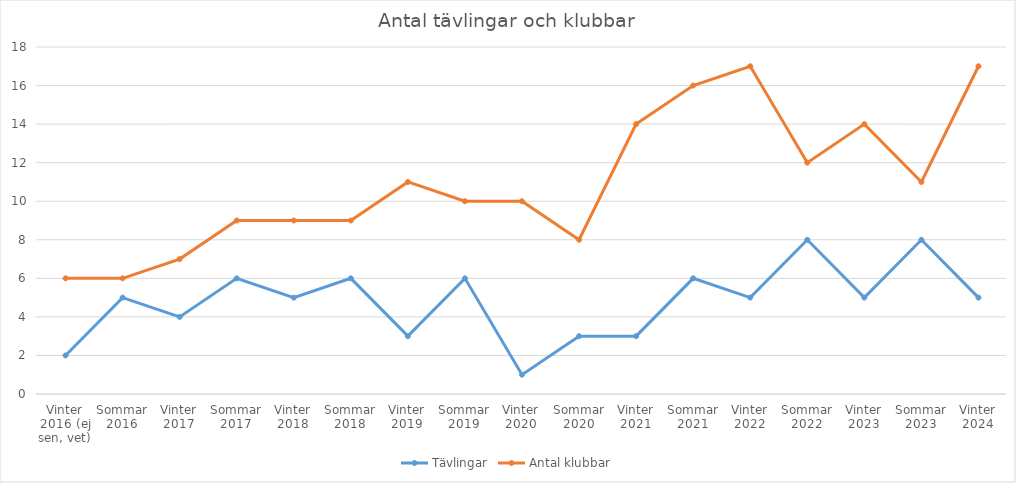
| Category | Tävlingar | Antal klubbar |
|---|---|---|
| Vinter 2016 (ej sen, vet) | 2 | 6 |
| Sommar 2016 | 5 | 6 |
| Vinter 2017 | 4 | 7 |
| Sommar 2017 | 6 | 9 |
| Vinter 2018 | 5 | 9 |
| Sommar 2018 | 6 | 9 |
| Vinter 2019 | 3 | 11 |
| Sommar 2019 | 6 | 10 |
| Vinter 2020 | 1 | 10 |
| Sommar 2020 | 3 | 8 |
| Vinter 2021 | 3 | 14 |
| Sommar 2021 | 6 | 16 |
| Vinter 2022 | 5 | 17 |
| Sommar 2022 | 8 | 12 |
| Vinter 2023 | 5 | 14 |
| Sommar 2023 | 8 | 11 |
| Vinter 2024 | 5 | 17 |